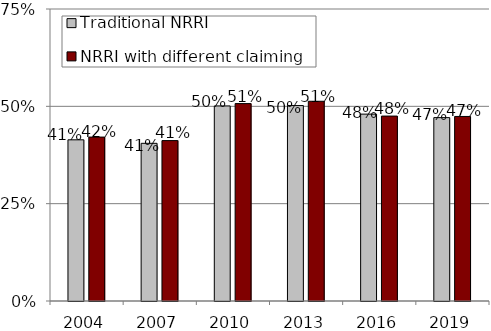
| Category | Traditional NRRI | NRRI with different claiming ages |
|---|---|---|
| 2004.0 | 0.414 | 0.421 |
| 2007.0 | 0.405 | 0.412 |
| 2010.0 | 0.501 | 0.507 |
| 2013.0 | 0.502 | 0.513 |
| 2016.0 | 0.48 | 0.475 |
| 2019.0 | 0.471 | 0.474 |